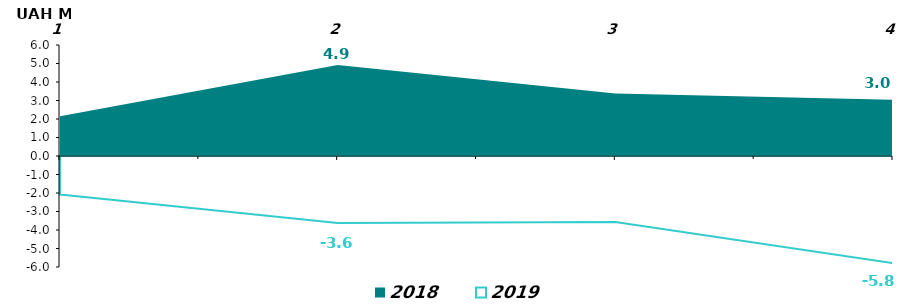
| Category | 2018 | 2019 |
|---|---|---|
| 0 | 2.145 | -2.084 |
| 1 | 4.915 | -3.621 |
| 2 | 3.384 | -3.57 |
| 3 | 3.042 | -5.787 |